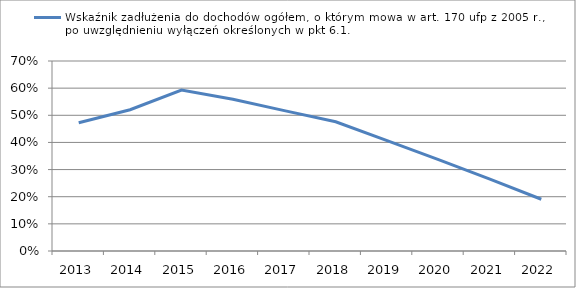
| Category | Wskaźnik zadłużenia do dochodów ogółem, o którym mowa w art. 170 ufp z 2005 r., po uwzględnieniu wyłączeń określonych w pkt 6.1.  |
|---|---|
| 2013.0 | 0.472 |
| 2014.0 | 0.52 |
| 2015.0 | 0.593 |
| 2016.0 | 0.559 |
| 2017.0 | 0.517 |
| 2018.0 | 0.476 |
| 2019.0 | 0.407 |
| 2020.0 | 0.337 |
| 2021.0 | 0.265 |
| 2022.0 | 0.191 |